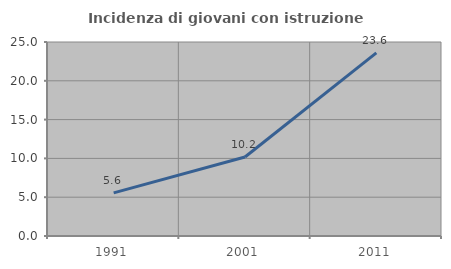
| Category | Incidenza di giovani con istruzione universitaria |
|---|---|
| 1991.0 | 5.556 |
| 2001.0 | 10.185 |
| 2011.0 | 23.596 |